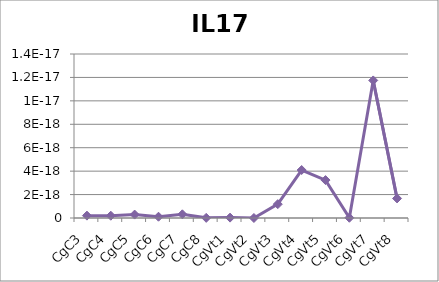
| Category | Series 0 |
|---|---|
| CgC3 | 0 |
| CgC4 | 0 |
| CgC5 | 0 |
| CgC6 | 0 |
| CgC7 | 0 |
| CgC8 | 0 |
| CgVt1 | 0 |
| CgVt2 | 0 |
| CgVt3 | 0 |
| CgVt4 | 0 |
| CgVt5 | 0 |
| CgVt6 | 0 |
| CgVt7 | 0 |
| CgVt8 | 0 |